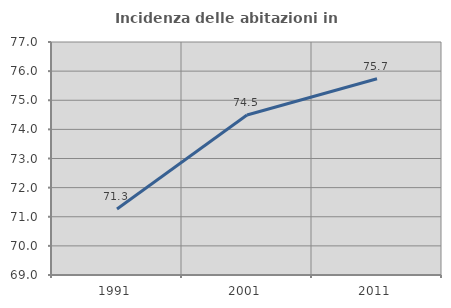
| Category | Incidenza delle abitazioni in proprietà  |
|---|---|
| 1991.0 | 71.269 |
| 2001.0 | 74.492 |
| 2011.0 | 75.74 |